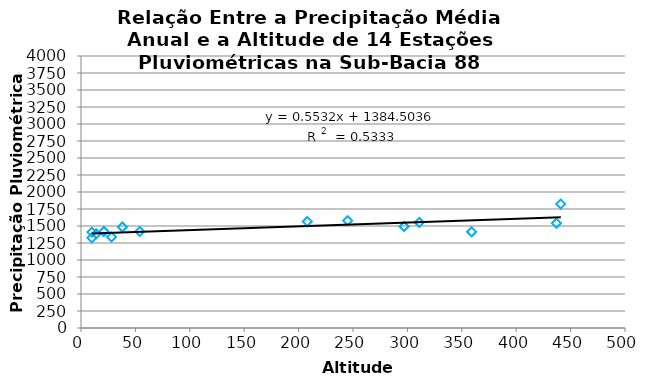
| Category | Series 0 |
|---|---|
| 21.0 | 1419.167 |
| 10.0 | 1409.69 |
| 14.0 | 1385.413 |
| 28.0 | 1338.724 |
| 297.0 | 1492.507 |
| 10.0 | 1325.723 |
| 311.0 | 1552.008 |
| 437.0 | 1541.193 |
| 359.0 | 1415.383 |
| 208.0 | 1565.23 |
| 54.0 | 1418.288 |
| 245.0 | 1579.257 |
| 441.0 | 1823.25 |
| 38.0 | 1485.35 |